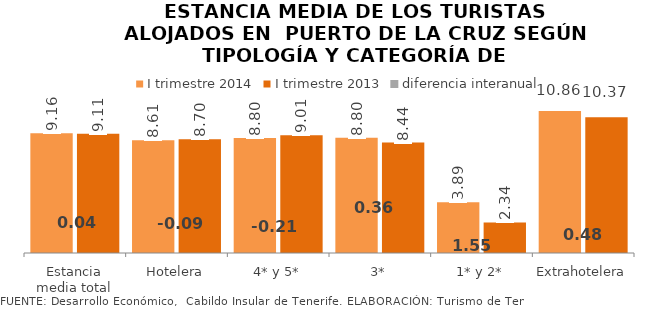
| Category | I trimestre 2014 | I trimestre 2013 |
|---|---|---|
| Estancia media total | 9.156 | 9.115 |
| Hotelera | 8.615 | 8.702 |
| 4* y 5* | 8.798 | 9.009 |
| 3* | 8.8 | 8.437 |
| 1* y 2* | 3.885 | 2.337 |
| Extrahotelera | 10.856 | 10.374 |